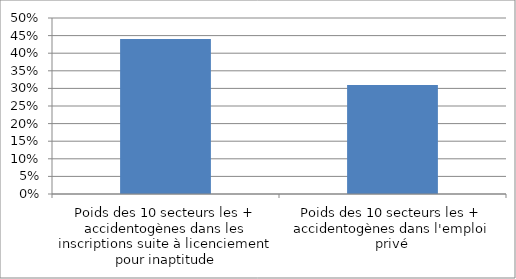
| Category | Series 0 |
|---|---|
| Poids des 10 secteurs les + accidentogènes dans les inscriptions suite à licenciement pour inaptitude | 0.44 |
| Poids des 10 secteurs les + accidentogènes dans l'emploi privé | 0.31 |